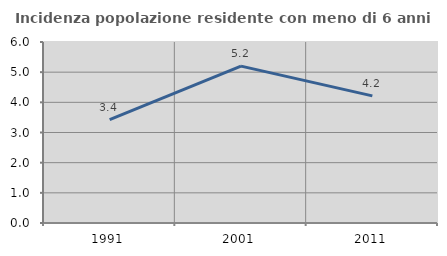
| Category | Incidenza popolazione residente con meno di 6 anni |
|---|---|
| 1991.0 | 3.427 |
| 2001.0 | 5.199 |
| 2011.0 | 4.213 |